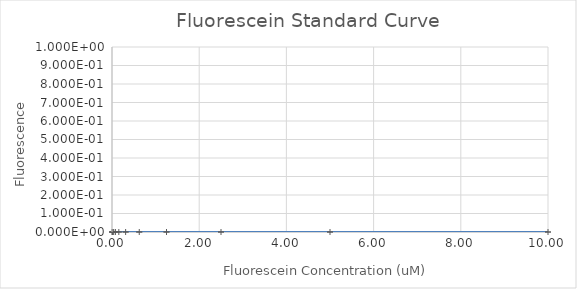
| Category | Series 0 |
|---|---|
| 10.0 | 0 |
| 5.0 | 0 |
| 2.5 | 0 |
| 1.25 | 0 |
| 0.625 | 0 |
| 0.3125 | 0 |
| 0.15625 | 0 |
| 0.078125 | 0 |
| 0.0390625 | 0 |
| 0.01953125 | 0 |
| 0.009765625 | 0 |
| 0.0 | 0 |